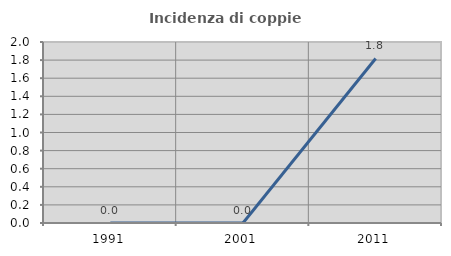
| Category | Incidenza di coppie miste |
|---|---|
| 1991.0 | 0 |
| 2001.0 | 0 |
| 2011.0 | 1.818 |